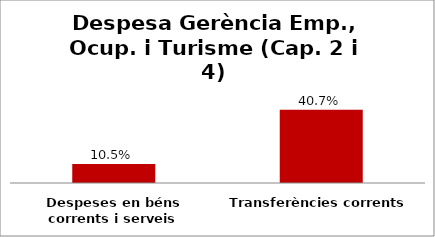
| Category | Series 0 |
|---|---|
| Despeses en béns corrents i serveis | 0.105 |
| Transferències corrents | 0.407 |